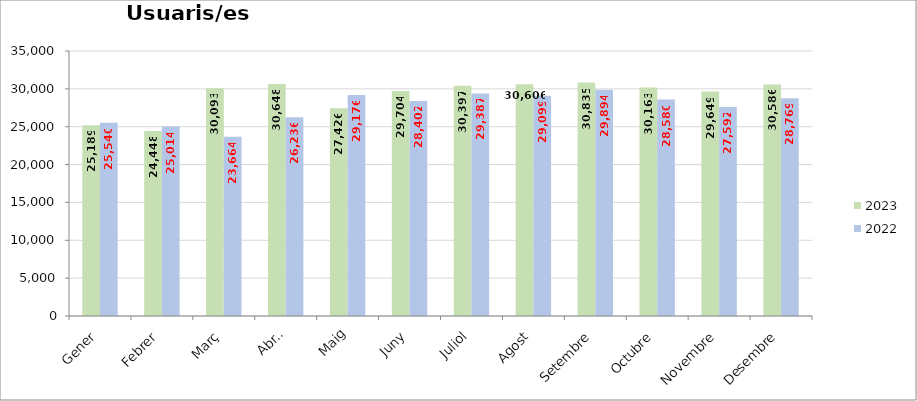
| Category | 2023 | 2022 |
|---|---|---|
| Gener | 25189 | 25540 |
| Febrer | 24448 | 25014 |
| Març | 30093 | 23664 |
| Abril | 30648 | 26236 |
| Maig | 27426 | 29176 |
| Juny | 29704 | 28402 |
| Juliol | 30397 | 29387 |
| Agost | 30606 | 29099 |
| Setembre | 30835 | 29894 |
| Octubre | 30163 | 28580 |
| Novembre | 29649 | 27592 |
| Desembre | 30586 | 28769 |